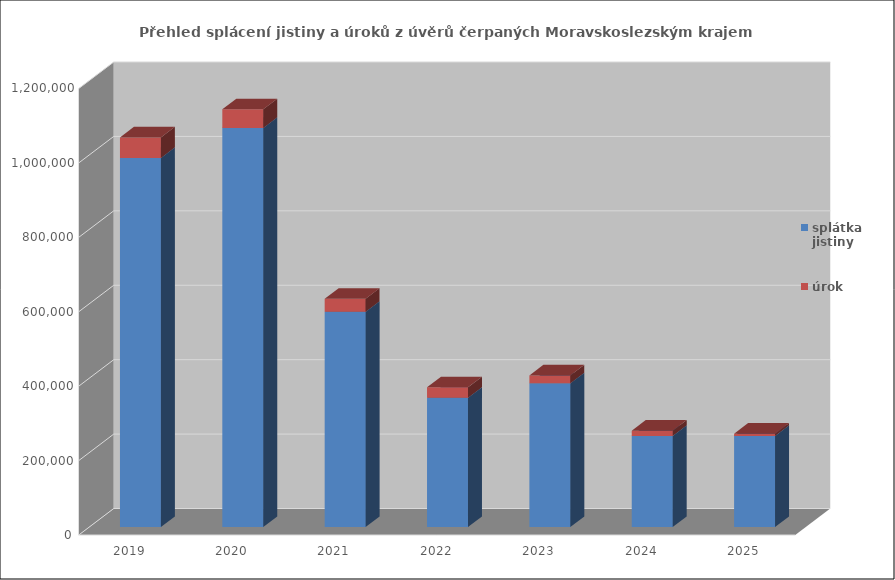
| Category | splátka jistiny | úrok |
|---|---|---|
| 2019.0 | 992148 | 55000 |
| 2020.0 | 1072569 | 50000 |
| 2021.0 | 578550 | 35000 |
| 2022.0 | 347456 | 28000 |
| 2023.0 | 386437 | 21000 |
| 2024.0 | 245000 | 14000 |
| 2025.0 | 245000 | 6000 |